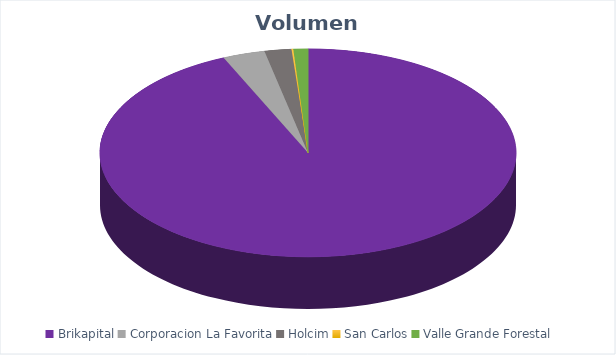
| Category | VOLUMEN ($USD) |
|---|---|
| Brikapital | 913000 |
| Corporacion La Favorita | 32026.56 |
| Holcim | 20440 |
| San Carlos | 1350 |
| Valle Grande Forestal | 11000.6 |